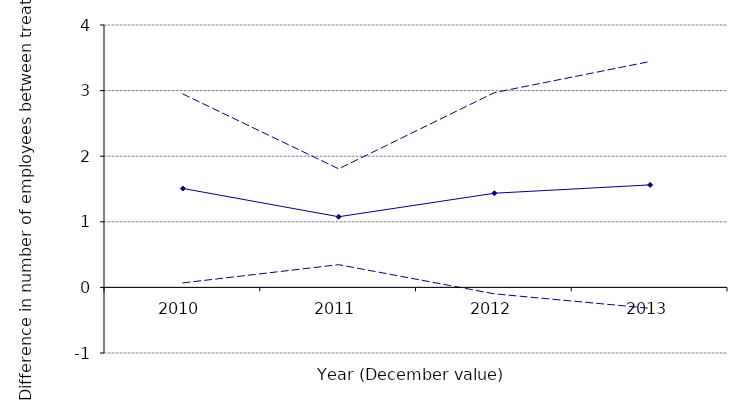
| Category | Mean diff | 5% | 95% |
|---|---|---|---|
| 2010.0 | 1.508 | 0.069 | 2.948 |
| 2011.0 | 1.077 | 0.346 | 1.808 |
| 2012.0 | 1.436 | -0.098 | 2.969 |
| 2013.0 | 1.563 | -0.318 | 3.444 |